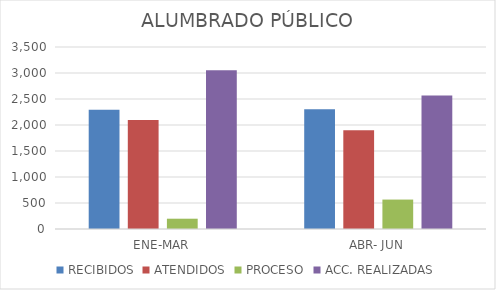
| Category | RECIBIDOS | ATENDIDOS | PROCESO | ACC. REALIZADAS |
|---|---|---|---|---|
| ENE-MAR | 2295 | 2097 | 198 | 3054 |
| ABR- JUN | 2301 | 1898 | 566 | 2569 |